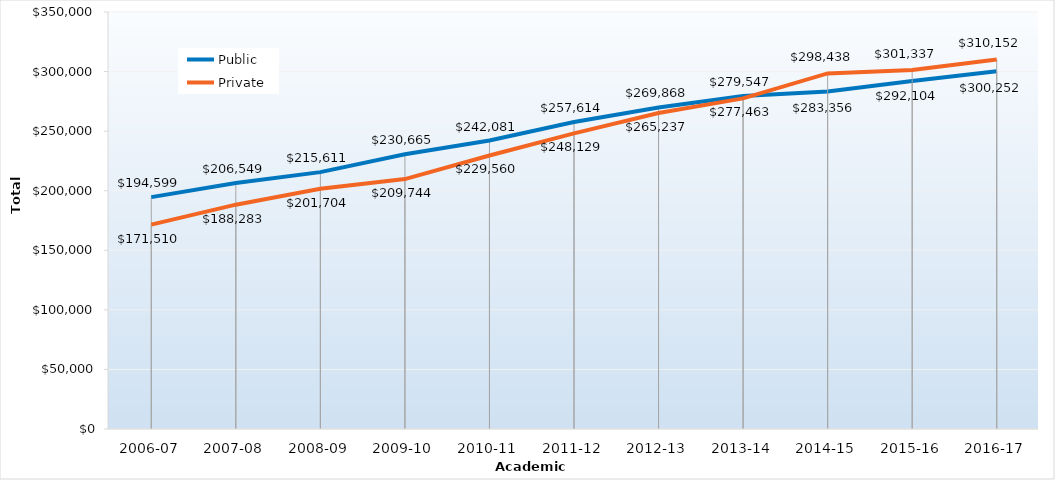
| Category | Public | Private |
|---|---|---|
| 2006-07 | 194599 | 171510 |
| 2007-08 | 206549 | 188283 |
| 2008-09 | 215611 | 201704 |
| 2009-10 | 230665 | 209744 |
| 2010-11 | 242081 | 229560 |
| 2011-12 | 257614 | 248129 |
| 2012-13 | 269868 | 265237 |
| 2013-14 | 279547 | 277463 |
| 2014-15 | 283356 | 298438 |
| 2015-16 | 292103.97 | 301337.21 |
| 2016-17 | 300252.49 | 310151.65 |